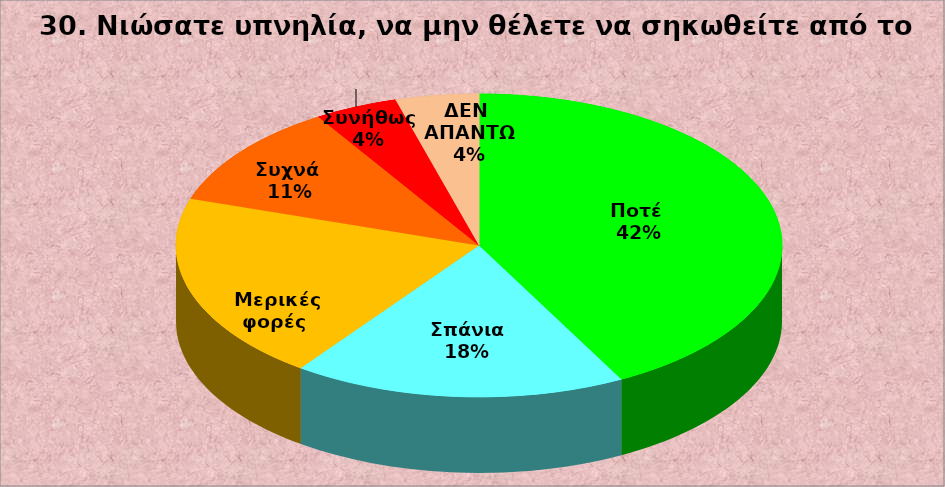
| Category | Series 0 |
|---|---|
| Ποτέ  | 19 |
| Σπάνια  | 8 |
| Μερικές φορές  | 9 |
| Συχνά  | 5 |
| Συνήθως  | 2 |
| ΔΕΝ ΑΠΑΝΤΩ | 2 |